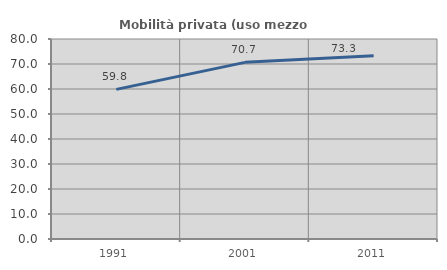
| Category | Mobilità privata (uso mezzo privato) |
|---|---|
| 1991.0 | 59.841 |
| 2001.0 | 70.659 |
| 2011.0 | 73.294 |